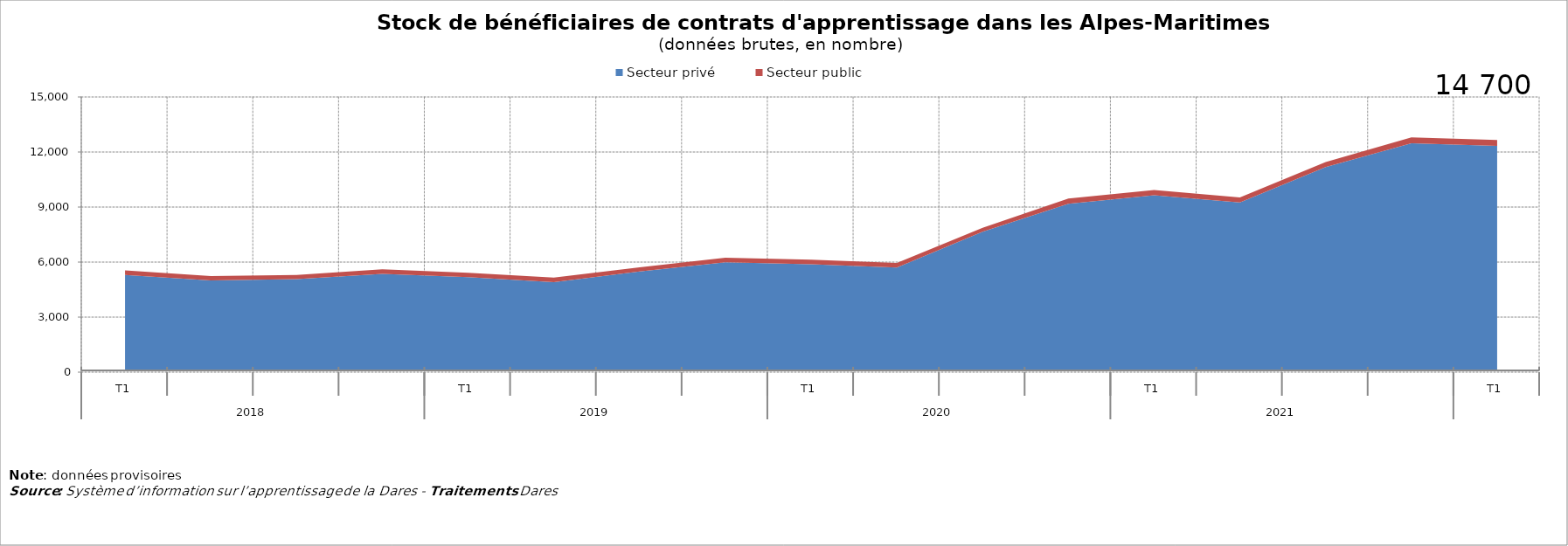
| Category | Secteur privé | Secteur public |
|---|---|---|
| 0 | 5292 | 250 |
| 1 | 4996 | 248 |
| 2 | 5072 | 221 |
| 3 | 5355 | 251 |
| 4 | 5174 | 245 |
| 5 | 4909 | 243 |
| 6 | 5493 | 225 |
| 7 | 5988 | 246 |
| 8 | 5882 | 246 |
| 9 | 5705 | 243 |
| 10 | 7652 | 218 |
| 11 | 9181 | 278 |
| 12 | 9642 | 281 |
| 13 | 9248 | 270 |
| 14 | 11183 | 272 |
| 15 | 12472 | 326 |
| 16 | 12328 | 329 |